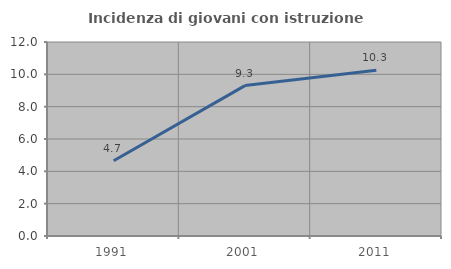
| Category | Incidenza di giovani con istruzione universitaria |
|---|---|
| 1991.0 | 4.651 |
| 2001.0 | 9.302 |
| 2011.0 | 10.256 |